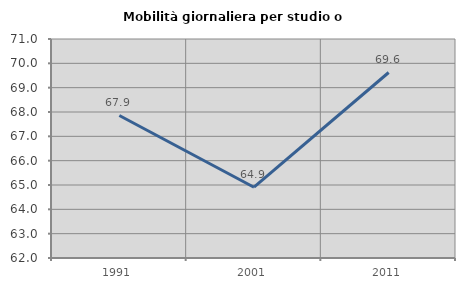
| Category | Mobilità giornaliera per studio o lavoro |
|---|---|
| 1991.0 | 67.856 |
| 2001.0 | 64.909 |
| 2011.0 | 69.623 |